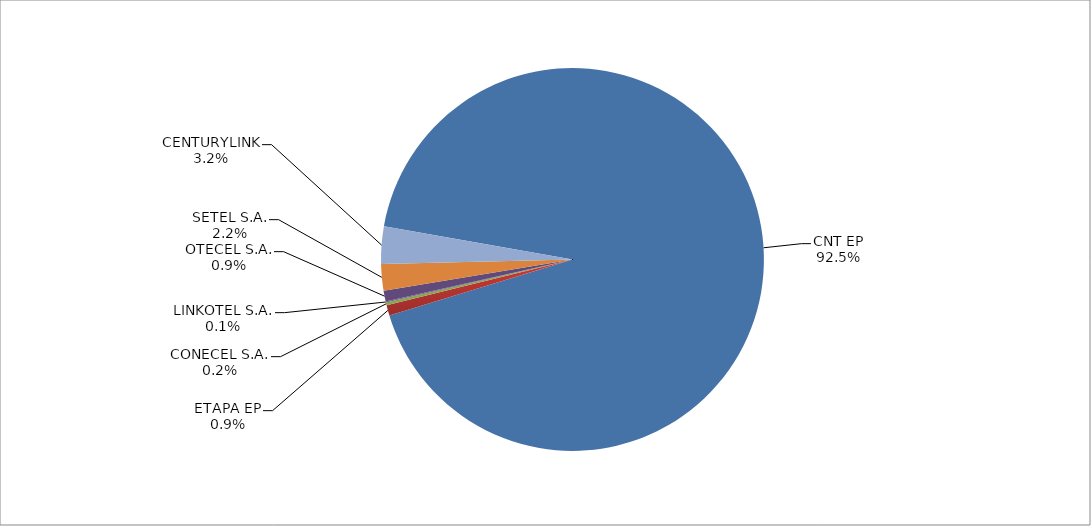
| Category | Series 0 |
|---|---|
| CNT EP | 2699 |
| ETAPA EP | 26 |
| CONECEL S.A. | 7 |
| LINKOTEL S.A. | 2 |
| OTECEL S.A. | 27 |
| SETEL S.A. | 65 |
| CENTURYLINK | 92 |